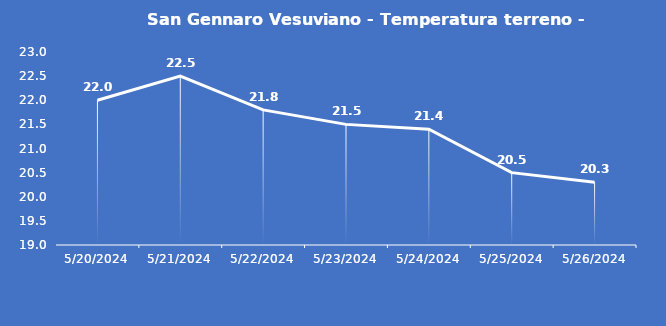
| Category | San Gennaro Vesuviano - Temperatura terreno - Grezzo (°C) |
|---|---|
| 5/20/24 | 22 |
| 5/21/24 | 22.5 |
| 5/22/24 | 21.8 |
| 5/23/24 | 21.5 |
| 5/24/24 | 21.4 |
| 5/25/24 | 20.5 |
| 5/26/24 | 20.3 |